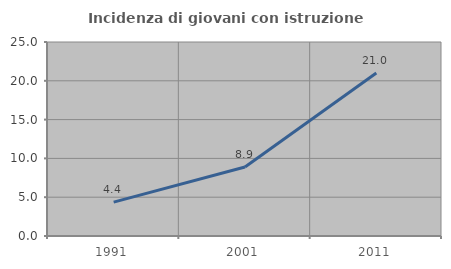
| Category | Incidenza di giovani con istruzione universitaria |
|---|---|
| 1991.0 | 4.372 |
| 2001.0 | 8.895 |
| 2011.0 | 21.006 |